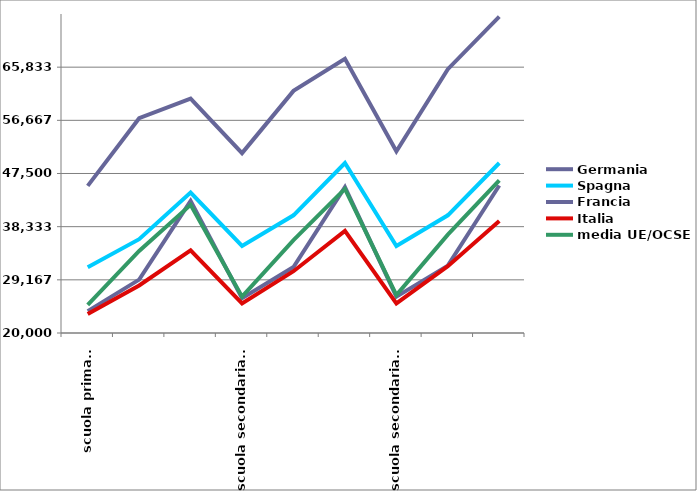
| Category | Germania | Spagna | Francia | Italia | media UE/OCSE |
|---|---|---|---|---|---|
| scuola primaria | 45364.071 | 31347.102 | 23775.588 | 23289.657 | 24843.509 |
|  | 57036.243 | 36180.492 | 29205.738 | 28200.632 | 34150 |
|  | 60406.246 | 44211.34 | 42779.388 | 34234.346 | 42100 |
| scuola secondaria 1° | 51016.034 | 35008.667 | 26011.034 | 25106.687 | 26261.751 |
|  | 61744.013 | 40288.056 | 31371.273 | 30653.63 | 36025.274 |
|  | 67258.449 | 49312.36 | 45160.697 | 37596.684 | 44854.525 |
| scuola secondaria 2° | 51334.432 | 35008.667 | 26254.416 | 25106.687 | 26542.391 |
|  | 65495.596 | 40288.056 | 31614.655 | 31512.134 | 36962.435 |
|  | 74538.238 | 49312.36 | 45428.25 | 39303.692 | 46301.481 |